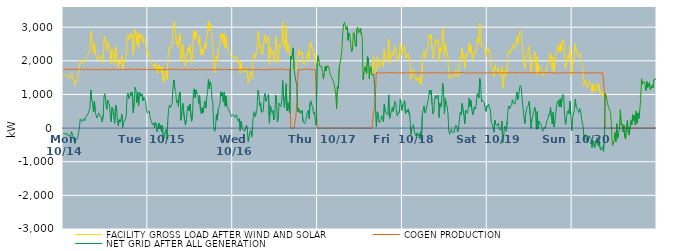
| Category | FACILITY GROSS LOAD AFTER WIND AND SOLAR | COGEN PRODUCTION | NET GRID AFTER ALL GENERATION |
|---|---|---|---|
|  Mon  10/14 | 1557 | 1737 | -180 |
|  Mon  10/14 | 1597 | 1738 | -141 |
|  Mon  10/14 | 1559 | 1751 | -192 |
|  Mon  10/14 | 1537 | 1734 | -197 |
|  Mon  10/14 | 1590 | 1742 | -152 |
|  Mon  10/14 | 1512 | 1739 | -227 |
|  Mon  10/14 | 1540 | 1753 | -213 |
|  Mon  10/14 | 1516 | 1740 | -224 |
|  Mon  10/14 | 1468 | 1740 | -272 |
|  Mon  10/14 | 1638 | 1750 | -112 |
|  Mon  10/14 | 1569 | 1753 | -184 |
|  Mon  10/14 | 1485 | 1739 | -254 |
|  Mon  10/14 | 1386 | 1749 | -363 |
|  Mon  10/14 | 1278 | 1735 | -457 |
|  Mon  10/14 | 1396 | 1739 | -343 |
|  Mon  10/14 | 1387 | 1740 | -353 |
|  Mon  10/14 | 1442 | 1753 | -311 |
|  Mon  10/14 | 1597 | 1740 | -143 |
|  Mon  10/14 | 1740 | 1747 | -7 |
|  Mon  10/14 | 2019 | 1745 | 274 |
|  Mon  10/14 | 2009 | 1754 | 255 |
|  Mon  10/14 | 1947 | 1752 | 195 |
|  Mon  10/14 | 1986 | 1748 | 238 |
|  Mon  10/14 | 2015 | 1734 | 281 |
|  Mon  10/14 | 1938 | 1726 | 212 |
|  Mon  10/14 | 2038 | 1733 | 305 |
|  Mon  10/14 | 2104 | 1753 | 351 |
|  Mon  10/14 | 2098 | 1733 | 365 |
|  Mon  10/14 | 2178 | 1740 | 438 |
|  Mon  10/14 | 2197 | 1730 | 467 |
|  Mon  10/14 | 2330 | 1736 | 594 |
|  Mon  10/14 | 2872 | 1736 | 1136 |
|  Mon  10/14 | 2583 | 1749 | 834 |
|  Mon  10/14 | 2475 | 1737 | 738 |
|  Mon  10/14 | 2219 | 1736 | 483 |
|  Mon  10/14 | 2541 | 1736 | 805 |
|  Mon  10/14 | 2224 | 1738 | 486 |
|  Mon  10/14 | 2117 | 1745 | 372 |
|  Mon  10/14 | 2027 | 1731 | 296 |
|  Mon  10/14 | 2060 | 1746 | 314 |
|  Mon  10/14 | 2196 | 1744 | 452 |
|  Mon  10/14 | 2138 | 1734 | 404 |
|  Mon  10/14 | 2156 | 1737 | 419 |
|  Mon  10/14 | 2019 | 1746 | 273 |
|  Mon  10/14 | 1931 | 1749 | 182 |
|  Mon  10/14 | 2136 | 1732 | 404 |
|  Mon  10/14 | 2708 | 1741 | 967 |
|  Mon  10/14 | 2744 | 1721 | 1023 |
|  Mon  10/14 | 2759 | 1751 | 1008 |
|  Mon  10/14 | 2302 | 1742 | 560 |
|  Mon  10/14 | 2566 | 1741 | 825 |
|  Mon  10/14 | 2498 | 1740 | 758 |
|  Mon  10/14 | 2456 | 1737 | 719 |
|  Mon  10/14 | 2161 | 1759 | 402 |
|  Mon  10/14 | 1920 | 1731 | 189 |
|  Mon  10/14 | 2348 | 1734 | 614 |
|  Mon  10/14 | 2303 | 1743 | 560 |
|  Mon  10/14 | 2276 | 1744 | 532 |
|  Mon  10/14 | 1890 | 1751 | 139 |
|  Mon  10/14 | 2427 | 1741 | 686 |
|  Mon  10/14 | 2377 | 1741 | 636 |
|  Mon  10/14 | 1966 | 1733 | 233 |
|  Mon  10/14 | 1806 | 1737 | 69 |
|  Mon  10/14 | 1993 | 1742 | 251 |
|  Mon  10/14 | 1920 | 1739 | 181 |
|  Mon  10/14 | 1980 | 1741 | 239 |
|  Mon  10/14 | 2172 | 1752 | 420 |
|  Mon  10/14 | 1762 | 1739 | 23 |
|  Mon  10/14 | 1894 | 1737 | 157 |
|  Mon  10/14 | 1911 | 1741 | 170 |
|  Mon  10/14 | 2014 | 1747 | 267 |
|  Mon  10/14 | 2098 | 1733 | 365 |
|  Mon  10/14 | 2696 | 1737 | 959 |
|  Mon  10/14 | 2774 | 1741 | 1033 |
|  Mon  10/14 | 2630 | 1751 | 879 |
|  Mon  10/14 | 2670 | 1744 | 926 |
|  Mon  10/14 | 2810 | 1744 | 1066 |
|  Mon  10/14 | 2681 | 1727 | 954 |
|  Mon  10/14 | 2818 | 1747 | 1071 |
|  Mon  10/14 | 2192 | 1732 | 460 |
|  Mon  10/14 | 2474 | 1735 | 739 |
|  Mon  10/14 | 2946 | 1736 | 1210 |
|  Mon  10/14 | 2874 | 1752 | 1122 |
|  Mon  10/14 | 2503 | 1745 | 758 |
|  Mon  10/14 | 2814 | 1751 | 1063 |
|  Mon  10/14 | 2398 | 1734 | 664 |
|  Mon  10/14 | 2811 | 1743 | 1068 |
|  Mon  10/14 | 2832 | 1746 | 1086 |
|  Mon  10/14 | 2689 | 1742 | 947 |
|  Mon  10/14 | 2757 | 1740 | 1017 |
|  Mon  10/14 | 2555 | 1739 | 816 |
|  Mon  10/14 | 2664 | 1752 | 912 |
|  Mon  10/14 | 2667 | 1747 | 920 |
|  Mon  10/14 | 2534 | 1741 | 793 |
|  Mon  10/14 | 2280 | 1745 | 535 |
|  Mon  10/14 | 2188 | 1743 | 445 |
|  Tue  10/15 | 2181 | 1737 | 444 |
|  Tue  10/15 | 2256 | 1749 | 507 |
|  Tue  10/15 | 2078 | 1742 | 336 |
|  Tue  10/15 | 1961 | 1734 | 227 |
|  Tue  10/15 | 1934 | 1732 | 202 |
|  Tue  10/15 | 1851 | 1750 | 101 |
|  Tue  10/15 | 1900 | 1749 | 151 |
|  Tue  10/15 | 1756 | 1749 | 7 |
|  Tue  10/15 | 1922 | 1743 | 179 |
|  Tue  10/15 | 1841 | 1746 | 95 |
|  Tue  10/15 | 1628 | 1737 | -109 |
|  Tue  10/15 | 1639 | 1743 | -104 |
|  Tue  10/15 | 1879 | 1730 | 149 |
|  Tue  10/15 | 1718 | 1744 | -26 |
|  Tue  10/15 | 1823 | 1735 | 88 |
|  Tue  10/15 | 1634 | 1735 | -101 |
|  Tue  10/15 | 1818 | 1745 | 73 |
|  Tue  10/15 | 1351 | 1754 | -403 |
|  Tue  10/15 | 1507 | 1732 | -225 |
|  Tue  10/15 | 1522 | 1740 | -218 |
|  Tue  10/15 | 1686 | 1735 | -49 |
|  Tue  10/15 | 1428 | 1750 | -322 |
|  Tue  10/15 | 1945 | 1748 | 197 |
|  Tue  10/15 | 2331 | 1748 | 583 |
|  Tue  10/15 | 2430 | 1741 | 689 |
|  Tue  10/15 | 2339 | 1731 | 608 |
|  Tue  10/15 | 2426 | 1761 | 665 |
|  Tue  10/15 | 2480 | 1750 | 730 |
|  Tue  10/15 | 2972 | 1742 | 1230 |
|  Tue  10/15 | 3164 | 1734 | 1430 |
|  Tue  10/15 | 2899 | 1740 | 1159 |
|  Tue  10/15 | 2823 | 1734 | 1089 |
|  Tue  10/15 | 2508 | 1745 | 763 |
|  Tue  10/15 | 2580 | 1763 | 817 |
|  Tue  10/15 | 2381 | 1738 | 643 |
|  Tue  10/15 | 2758 | 1746 | 1012 |
|  Tue  10/15 | 2813 | 1739 | 1074 |
|  Tue  10/15 | 1974 | 1741 | 233 |
|  Tue  10/15 | 2210 | 1733 | 477 |
|  Tue  10/15 | 2478 | 1745 | 733 |
|  Tue  10/15 | 2484 | 1742 | 742 |
|  Tue  10/15 | 2005 | 1753 | 252 |
|  Tue  10/15 | 1838 | 1752 | 86 |
|  Tue  10/15 | 1979 | 1736 | 243 |
|  Tue  10/15 | 2238 | 1743 | 495 |
|  Tue  10/15 | 2380 | 1725 | 655 |
|  Tue  10/15 | 2247 | 1735 | 512 |
|  Tue  10/15 | 2466 | 1747 | 719 |
|  Tue  10/15 | 2464 | 1744 | 720 |
|  Tue  10/15 | 1934 | 1731 | 203 |
|  Tue  10/15 | 2134 | 1749 | 385 |
|  Tue  10/15 | 2801 | 1739 | 1062 |
|  Tue  10/15 | 2907 | 1739 | 1168 |
|  Tue  10/15 | 2636 | 1742 | 894 |
|  Tue  10/15 | 2876 | 1740 | 1136 |
|  Tue  10/15 | 2763 | 1742 | 1021 |
|  Tue  10/15 | 2719 | 1730 | 989 |
|  Tue  10/15 | 2485 | 1753 | 732 |
|  Tue  10/15 | 2727 | 1751 | 976 |
|  Tue  10/15 | 2277 | 1744 | 533 |
|  Tue  10/15 | 2165 | 1742 | 423 |
|  Tue  10/15 | 2349 | 1743 | 606 |
|  Tue  10/15 | 2186 | 1734 | 452 |
|  Tue  10/15 | 2391 | 1749 | 642 |
|  Tue  10/15 | 2523 | 1729 | 794 |
|  Tue  10/15 | 2357 | 1757 | 600 |
|  Tue  10/15 | 2651 | 1746 | 905 |
|  Tue  10/15 | 2808 | 1744 | 1064 |
|  Tue  10/15 | 3188 | 1737 | 1451 |
|  Tue  10/15 | 2895 | 1730 | 1165 |
|  Tue  10/15 | 3116 | 1735 | 1381 |
|  Tue  10/15 | 3062 | 1741 | 1321 |
|  Tue  10/15 | 2640 | 1743 | 897 |
|  Tue  10/15 | 2497 | 1753 | 744 |
|  Tue  10/15 | 1772 | 1735 | 37 |
|  Tue  10/15 | 1643 | 1736 | -93 |
|  Tue  10/15 | 1749 | 1732 | 17 |
|  Tue  10/15 | 2144 | 1732 | 412 |
|  Tue  10/15 | 1978 | 1743 | 235 |
|  Tue  10/15 | 2267 | 1743 | 524 |
|  Tue  10/15 | 2387 | 1751 | 636 |
|  Tue  10/15 | 2466 | 1748 | 718 |
|  Tue  10/15 | 2826 | 1744 | 1082 |
|  Tue  10/15 | 2699 | 1744 | 955 |
|  Tue  10/15 | 2787 | 1733 | 1054 |
|  Tue  10/15 | 2527 | 1754 | 773 |
|  Tue  10/15 | 2806 | 1743 | 1063 |
|  Tue  10/15 | 2388 | 1735 | 653 |
|  Tue  10/15 | 2701 | 1742 | 959 |
|  Tue  10/15 | 2372 | 1729 | 643 |
|  Tue  10/15 | 2339 | 1744 | 595 |
|  Tue  10/15 | 2274 | 1731 | 543 |
|  Tue  10/15 | 2206 | 1737 | 469 |
|  Tue  10/15 | 2171 | 1740 | 431 |
|  Tue  10/15 | 2085 | 1739 | 346 |
|  Tue  10/15 | 2104 | 1747 | 357 |
|  Wed  10/16 | 2139 | 1732 | 407 |
|  Wed  10/16 | 2126 | 1745 | 381 |
|  Wed  10/16 | 2059 | 1740 | 319 |
|  Wed  10/16 | 2055 | 1751 | 304 |
|  Wed  10/16 | 2135 | 1736 | 399 |
|  Wed  10/16 | 1983 | 1748 | 235 |
|  Wed  10/16 | 1936 | 1745 | 191 |
|  Wed  10/16 | 2026 | 1738 | 288 |
|  Wed  10/16 | 1647 | 1731 | -84 |
|  Wed  10/16 | 1947 | 1745 | 202 |
|  Wed  10/16 | 1768 | 1741 | 27 |
|  Wed  10/16 | 1709 | 1741 | -32 |
|  Wed  10/16 | 1734 | 1758 | -24 |
|  Wed  10/16 | 1656 | 1755 | -99 |
|  Wed  10/16 | 1652 | 1752 | -100 |
|  Wed  10/16 | 1818 | 1736 | 82 |
|  Wed  10/16 | 1714 | 1740 | -26 |
|  Wed  10/16 | 1334 | 1741 | -407 |
|  Wed  10/16 | 1495 | 1748 | -253 |
|  Wed  10/16 | 1632 | 1744 | -112 |
|  Wed  10/16 | 1669 | 1740 | -71 |
|  Wed  10/16 | 1471 | 1732 | -261 |
|  Wed  10/16 | 1800 | 1736 | 64 |
|  Wed  10/16 | 2164 | 1735 | 429 |
|  Wed  10/16 | 2232 | 1740 | 492 |
|  Wed  10/16 | 2078 | 1742 | 336 |
|  Wed  10/16 | 2191 | 1738 | 453 |
|  Wed  10/16 | 2320 | 1736 | 584 |
|  Wed  10/16 | 2869 | 1745 | 1124 |
|  Wed  10/16 | 2807 | 1750 | 1057 |
|  Wed  10/16 | 2401 | 1739 | 662 |
|  Wed  10/16 | 2496 | 1745 | 751 |
|  Wed  10/16 | 2213 | 1740 | 473 |
|  Wed  10/16 | 2176 | 1732 | 444 |
|  Wed  10/16 | 2231 | 1737 | 494 |
|  Wed  10/16 | 2653 | 1739 | 914 |
|  Wed  10/16 | 2761 | 1733 | 1028 |
|  Wed  10/16 | 2531 | 1731 | 800 |
|  Wed  10/16 | 2616 | 1744 | 872 |
|  Wed  10/16 | 2596 | 1740 | 856 |
|  Wed  10/16 | 2731 | 1729 | 1002 |
|  Wed  10/16 | 1883 | 1738 | 145 |
|  Wed  10/16 | 2412 | 1746 | 666 |
|  Wed  10/16 | 2317 | 1752 | 565 |
|  Wed  10/16 | 2211 | 1750 | 461 |
|  Wed  10/16 | 2268 | 1747 | 521 |
|  Wed  10/16 | 1987 | 1745 | 242 |
|  Wed  10/16 | 2026 | 1742 | 284 |
|  Wed  10/16 | 2736 | 1750 | 986 |
|  Wed  10/16 | 2637 | 1747 | 890 |
|  Wed  10/16 | 1919 | 1739 | 180 |
|  Wed  10/16 | 2053 | 1739 | 314 |
|  Wed  10/16 | 2489 | 1755 | 734 |
|  Wed  10/16 | 2416 | 1745 | 671 |
|  Wed  10/16 | 2396 | 1759 | 637 |
|  Wed  10/16 | 2569 | 1741 | 828 |
|  Wed  10/16 | 3161 | 1747 | 1414 |
|  Wed  10/16 | 2585 | 1738 | 847 |
|  Wed  10/16 | 2352 | 1741 | 611 |
|  Wed  10/16 | 2694 | 1743 | 951 |
|  Wed  10/16 | 3051 | 1731 | 1320 |
|  Wed  10/16 | 2267 | 1758 | 509 |
|  Wed  10/16 | 2490 | 1738 | 752 |
|  Wed  10/16 | 2510 | 1732 | 778 |
|  Wed  10/16 | 2192 | 1743 | 449 |
|  Wed  10/16 | 2133 | 0 | 2133 |
|  Wed  10/16 | 2024 | 0 | 2024 |
|  Wed  10/16 | 2025 | 0 | 2025 |
|  Wed  10/16 | 2384 | 0 | 2384 |
|  Wed  10/16 | 1730 | 0 | 1730 |
|  Wed  10/16 | 1739 | 0 | 1739 |
|  Wed  10/16 | 1740 | 350 | 1390 |
|  Wed  10/16 | 2024 | 740 | 1284 |
|  Wed  10/16 | 1983 | 1493 | 490 |
|  Wed  10/16 | 2355 | 1758 | 597 |
|  Wed  10/16 | 2179 | 1722 | 457 |
|  Wed  10/16 | 2239 | 1729 | 510 |
|  Wed  10/16 | 2184 | 1743 | 441 |
|  Wed  10/16 | 2259 | 1733 | 526 |
|  Wed  10/16 | 1932 | 1738 | 194 |
|  Wed  10/16 | 1924 | 1742 | 182 |
|  Wed  10/16 | 1886 | 1755 | 131 |
|  Wed  10/16 | 1958 | 1743 | 215 |
|  Wed  10/16 | 1948 | 1750 | 198 |
|  Wed  10/16 | 2232 | 1752 | 480 |
|  Wed  10/16 | 2276 | 1749 | 527 |
|  Wed  10/16 | 2007 | 1734 | 273 |
|  Wed  10/16 | 2503 | 1746 | 757 |
|  Wed  10/16 | 2551 | 1738 | 813 |
|  Wed  10/16 | 2422 | 1742 | 680 |
|  Wed  10/16 | 2360 | 1737 | 623 |
|  Wed  10/16 | 2160 | 1738 | 422 |
|  Wed  10/16 | 2229 | 1757 | 472 |
|  Wed  10/16 | 1967 | 1745 | 222 |
|  Wed  10/16 | 1808 | 1730 | 78 |
|  Wed  10/16 | 1935 | 0 | 1935 |
|  Thu  10/17 | 2157 | 0 | 2157 |
|  Thu  10/17 | 1994 | 0 | 1994 |
|  Thu  10/17 | 1842 | 0 | 1842 |
|  Thu  10/17 | 1865 | 0 | 1865 |
|  Thu  10/17 | 1836 | 0 | 1836 |
|  Thu  10/17 | 1656 | 0 | 1656 |
|  Thu  10/17 | 1463 | 0 | 1463 |
|  Thu  10/17 | 1619 | 0 | 1619 |
|  Thu  10/17 | 1829 | 0 | 1829 |
|  Thu  10/17 | 1696 | 0 | 1696 |
|  Thu  10/17 | 1854 | 0 | 1854 |
|  Thu  10/17 | 1803 | 0 | 1803 |
|  Thu  10/17 | 1837 | 0 | 1837 |
|  Thu  10/17 | 1694 | 0 | 1694 |
|  Thu  10/17 | 1579 | 0 | 1579 |
|  Thu  10/17 | 1523 | 0 | 1523 |
|  Thu  10/17 | 1472 | 0 | 1472 |
|  Thu  10/17 | 1493 | 0 | 1493 |
|  Thu  10/17 | 1354 | 0 | 1354 |
|  Thu  10/17 | 1325 | 0 | 1325 |
|  Thu  10/17 | 1025 | 0 | 1025 |
|  Thu  10/17 | 575 | 0 | 575 |
|  Thu  10/17 | 1244 | 0 | 1244 |
|  Thu  10/17 | 1177 | 0 | 1177 |
|  Thu  10/17 | 1797 | 0 | 1797 |
|  Thu  10/17 | 1817 | 0 | 1817 |
|  Thu  10/17 | 2083 | 0 | 2083 |
|  Thu  10/17 | 2340 | 0 | 2340 |
|  Thu  10/17 | 2821 | 0 | 2821 |
|  Thu  10/17 | 3094 | 0 | 3094 |
|  Thu  10/17 | 3138 | 0 | 3138 |
|  Thu  10/17 | 3014 | 0 | 3014 |
|  Thu  10/17 | 2925 | 0 | 2925 |
|  Thu  10/17 | 3019 | 0 | 3019 |
|  Thu  10/17 | 2608 | 0 | 2608 |
|  Thu  10/17 | 2828 | 0 | 2828 |
|  Thu  10/17 | 2751 | 0 | 2751 |
|  Thu  10/17 | 2488 | 0 | 2488 |
|  Thu  10/17 | 2267 | 0 | 2267 |
|  Thu  10/17 | 2349 | 0 | 2349 |
|  Thu  10/17 | 2843 | 0 | 2843 |
|  Thu  10/17 | 2803 | 0 | 2803 |
|  Thu  10/17 | 2482 | 0 | 2482 |
|  Thu  10/17 | 2416 | 0 | 2416 |
|  Thu  10/17 | 2942 | 0 | 2942 |
|  Thu  10/17 | 2997 | 0 | 2997 |
|  Thu  10/17 | 2833 | 0 | 2833 |
|  Thu  10/17 | 2896 | 0 | 2896 |
|  Thu  10/17 | 2970 | 0 | 2970 |
|  Thu  10/17 | 2784 | 0 | 2784 |
|  Thu  10/17 | 2702 | 0 | 2702 |
|  Thu  10/17 | 1445 | 0 | 1445 |
|  Thu  10/17 | 1668 | 0 | 1668 |
|  Thu  10/17 | 1821 | 0 | 1821 |
|  Thu  10/17 | 1846 | 0 | 1846 |
|  Thu  10/17 | 1627 | 0 | 1627 |
|  Thu  10/17 | 2126 | 0 | 2126 |
|  Thu  10/17 | 2073 | 0 | 2073 |
|  Thu  10/17 | 1471 | 0 | 1471 |
|  Thu  10/17 | 1791 | 0 | 1791 |
|  Thu  10/17 | 1830 | 0 | 1830 |
|  Thu  10/17 | 1571 | 0 | 1571 |
|  Thu  10/17 | 1587 | 0 | 1587 |
|  Thu  10/17 | 2109 | 509 | 1600 |
|  Thu  10/17 | 1902 | 637 | 1265 |
|  Thu  10/17 | 1632 | 1081 | 551 |
|  Thu  10/17 | 1689 | 1656 | 33 |
|  Thu  10/17 | 2126 | 1641 | 485 |
|  Thu  10/17 | 2088 | 1645 | 443 |
|  Thu  10/17 | 1810 | 1643 | 167 |
|  Thu  10/17 | 1805 | 1644 | 161 |
|  Thu  10/17 | 1862 | 1647 | 215 |
|  Thu  10/17 | 1997 | 1629 | 368 |
|  Thu  10/17 | 1963 | 1643 | 320 |
|  Thu  10/17 | 1827 | 1646 | 181 |
|  Thu  10/17 | 2346 | 1639 | 707 |
|  Thu  10/17 | 2146 | 1635 | 511 |
|  Thu  10/17 | 2098 | 1632 | 466 |
|  Thu  10/17 | 2076 | 1648 | 428 |
|  Thu  10/17 | 2014 | 1635 | 379 |
|  Thu  10/17 | 2637 | 1648 | 989 |
|  Thu  10/17 | 1926 | 1635 | 291 |
|  Thu  10/17 | 2060 | 1656 | 404 |
|  Thu  10/17 | 2166 | 1647 | 519 |
|  Thu  10/17 | 2250 | 1643 | 607 |
|  Thu  10/17 | 2140 | 1645 | 495 |
|  Thu  10/17 | 2297 | 1644 | 653 |
|  Thu  10/17 | 2432 | 1633 | 799 |
|  Thu  10/17 | 2383 | 1651 | 732 |
|  Thu  10/17 | 2064 | 1645 | 419 |
|  Thu  10/17 | 1992 | 1635 | 357 |
|  Thu  10/17 | 2130 | 1643 | 487 |
|  Thu  10/17 | 2094 | 1640 | 454 |
|  Thu  10/17 | 2517 | 1650 | 867 |
|  Thu  10/17 | 2386 | 1640 | 746 |
|  Thu  10/17 | 2170 | 1643 | 527 |
|  Fri  10/18 | 2346 | 1649 | 697 |
|  Fri  10/18 | 2374 | 1639 | 735 |
|  Fri  10/18 | 2449 | 1636 | 813 |
|  Fri  10/18 | 2064 | 1639 | 425 |
|  Fri  10/18 | 2162 | 1643 | 519 |
|  Fri  10/18 | 2122 | 1640 | 482 |
|  Fri  10/18 | 2214 | 1643 | 571 |
|  Fri  10/18 | 2198 | 1646 | 552 |
|  Fri  10/18 | 1980 | 1643 | 337 |
|  Fri  10/18 | 1462 | 1649 | -187 |
|  Fri  10/18 | 1623 | 1649 | -26 |
|  Fri  10/18 | 1694 | 1645 | 49 |
|  Fri  10/18 | 1744 | 1636 | 108 |
|  Fri  10/18 | 1535 | 1641 | -106 |
|  Fri  10/18 | 1555 | 1646 | -91 |
|  Fri  10/18 | 1400 | 1637 | -237 |
|  Fri  10/18 | 1503 | 1641 | -138 |
|  Fri  10/18 | 1425 | 1636 | -211 |
|  Fri  10/18 | 1473 | 1642 | -169 |
|  Fri  10/18 | 1326 | 1654 | -328 |
|  Fri  10/18 | 1545 | 1646 | -101 |
|  Fri  10/18 | 1308 | 1649 | -341 |
|  Fri  10/18 | 2042 | 1640 | 402 |
|  Fri  10/18 | 2175 | 1642 | 533 |
|  Fri  10/18 | 2303 | 1645 | 658 |
|  Fri  10/18 | 2084 | 1632 | 452 |
|  Fri  10/18 | 2141 | 1637 | 504 |
|  Fri  10/18 | 2265 | 1640 | 625 |
|  Fri  10/18 | 2425 | 1640 | 785 |
|  Fri  10/18 | 2505 | 1642 | 863 |
|  Fri  10/18 | 2780 | 1649 | 1131 |
|  Fri  10/18 | 2654 | 1646 | 1008 |
|  Fri  10/18 | 2773 | 1647 | 1126 |
|  Fri  10/18 | 2363 | 1645 | 718 |
|  Fri  10/18 | 2061 | 1633 | 428 |
|  Fri  10/18 | 2144 | 1641 | 503 |
|  Fri  10/18 | 2511 | 1650 | 861 |
|  Fri  10/18 | 2628 | 1657 | 971 |
|  Fri  10/18 | 2512 | 1648 | 864 |
|  Fri  10/18 | 2585 | 1640 | 945 |
|  Fri  10/18 | 2632 | 1643 | 989 |
|  Fri  10/18 | 1967 | 1651 | 316 |
|  Fri  10/18 | 2384 | 1646 | 738 |
|  Fri  10/18 | 2275 | 1640 | 635 |
|  Fri  10/18 | 2438 | 1630 | 808 |
|  Fri  10/18 | 2981 | 1640 | 1341 |
|  Fri  10/18 | 2712 | 1644 | 1068 |
|  Fri  10/18 | 2081 | 1652 | 429 |
|  Fri  10/18 | 2523 | 1640 | 883 |
|  Fri  10/18 | 2356 | 1640 | 716 |
|  Fri  10/18 | 2286 | 1638 | 648 |
|  Fri  10/18 | 2088 | 1637 | 451 |
|  Fri  10/18 | 1535 | 1641 | -106 |
|  Fri  10/18 | 1465 | 1650 | -185 |
|  Fri  10/18 | 1569 | 1640 | -71 |
|  Fri  10/18 | 1588 | 1627 | -39 |
|  Fri  10/18 | 1519 | 1644 | -125 |
|  Fri  10/18 | 1501 | 1648 | -147 |
|  Fri  10/18 | 1515 | 1644 | -129 |
|  Fri  10/18 | 1673 | 1652 | 21 |
|  Fri  10/18 | 1734 | 1645 | 89 |
|  Fri  10/18 | 1688 | 1634 | 54 |
|  Fri  10/18 | 1529 | 1639 | -110 |
|  Fri  10/18 | 1620 | 1632 | -12 |
|  Fri  10/18 | 1918 | 1654 | 264 |
|  Fri  10/18 | 2119 | 1645 | 474 |
|  Fri  10/18 | 2055 | 1644 | 411 |
|  Fri  10/18 | 2379 | 1645 | 734 |
|  Fri  10/18 | 2373 | 1656 | 717 |
|  Fri  10/18 | 2048 | 1657 | 391 |
|  Fri  10/18 | 1778 | 1652 | 126 |
|  Fri  10/18 | 2190 | 1656 | 534 |
|  Fri  10/18 | 2110 | 1627 | 483 |
|  Fri  10/18 | 2087 | 1644 | 443 |
|  Fri  10/18 | 2230 | 1639 | 591 |
|  Fri  10/18 | 2531 | 1639 | 892 |
|  Fri  10/18 | 2272 | 1628 | 644 |
|  Fri  10/18 | 2455 | 1628 | 827 |
|  Fri  10/18 | 2192 | 1648 | 544 |
|  Fri  10/18 | 2031 | 1640 | 391 |
|  Fri  10/18 | 2020 | 1640 | 380 |
|  Fri  10/18 | 2276 | 1644 | 632 |
|  Fri  10/18 | 2215 | 1642 | 573 |
|  Fri  10/18 | 2319 | 1638 | 681 |
|  Fri  10/18 | 2668 | 1646 | 1022 |
|  Fri  10/18 | 2654 | 1644 | 1010 |
|  Fri  10/18 | 2530 | 1636 | 894 |
|  Fri  10/18 | 3109 | 1641 | 1468 |
|  Fri  10/18 | 2937 | 1643 | 1294 |
|  Fri  10/18 | 2417 | 1634 | 783 |
|  Fri  10/18 | 2465 | 1636 | 829 |
|  Fri  10/18 | 2453 | 1640 | 813 |
|  Fri  10/18 | 2398 | 1643 | 755 |
|  Fri  10/18 | 2238 | 1645 | 593 |
|  Fri  10/18 | 2136 | 1642 | 494 |
|  Fri  10/18 | 2305 | 1641 | 664 |
|  Sat  10/19 | 2266 | 1637 | 629 |
|  Sat  10/19 | 2362 | 1651 | 711 |
|  Sat  10/19 | 2248 | 1654 | 594 |
|  Sat  10/19 | 2194 | 1645 | 549 |
|  Sat  10/19 | 1827 | 1644 | 183 |
|  Sat  10/19 | 1766 | 1636 | 130 |
|  Sat  10/19 | 1769 | 1633 | 136 |
|  Sat  10/19 | 1520 | 1641 | -121 |
|  Sat  10/19 | 1877 | 1642 | 235 |
|  Sat  10/19 | 1740 | 1635 | 105 |
|  Sat  10/19 | 1718 | 1650 | 68 |
|  Sat  10/19 | 1709 | 1635 | 74 |
|  Sat  10/19 | 1785 | 1640 | 145 |
|  Sat  10/19 | 1602 | 1640 | -38 |
|  Sat  10/19 | 1620 | 1634 | -14 |
|  Sat  10/19 | 1594 | 1648 | -54 |
|  Sat  10/19 | 1837 | 1632 | 205 |
|  Sat  10/19 | 1203 | 1638 | -435 |
|  Sat  10/19 | 1386 | 1653 | -267 |
|  Sat  10/19 | 1706 | 1646 | 60 |
|  Sat  10/19 | 1667 | 1639 | 28 |
|  Sat  10/19 | 1550 | 1643 | -93 |
|  Sat  10/19 | 1857 | 1644 | 213 |
|  Sat  10/19 | 2198 | 1650 | 548 |
|  Sat  10/19 | 2307 | 1647 | 660 |
|  Sat  10/19 | 2222 | 1641 | 581 |
|  Sat  10/19 | 2288 | 1638 | 650 |
|  Sat  10/19 | 2324 | 1642 | 682 |
|  Sat  10/19 | 2484 | 1645 | 839 |
|  Sat  10/19 | 2376 | 1627 | 749 |
|  Sat  10/19 | 2385 | 1649 | 736 |
|  Sat  10/19 | 2367 | 1656 | 711 |
|  Sat  10/19 | 2372 | 1644 | 728 |
|  Sat  10/19 | 2721 | 1650 | 1071 |
|  Sat  10/19 | 2500 | 1647 | 853 |
|  Sat  10/19 | 2578 | 1639 | 939 |
|  Sat  10/19 | 2847 | 1645 | 1202 |
|  Sat  10/19 | 2908 | 1637 | 1271 |
|  Sat  10/19 | 2852 | 1644 | 1208 |
|  Sat  10/19 | 2479 | 1642 | 837 |
|  Sat  10/19 | 2210 | 1636 | 574 |
|  Sat  10/19 | 1951 | 1644 | 307 |
|  Sat  10/19 | 1781 | 1643 | 138 |
|  Sat  10/19 | 2075 | 1645 | 430 |
|  Sat  10/19 | 2225 | 1651 | 574 |
|  Sat  10/19 | 2217 | 1644 | 573 |
|  Sat  10/19 | 2337 | 1656 | 681 |
|  Sat  10/19 | 2430 | 1635 | 795 |
|  Sat  10/19 | 2030 | 1642 | 388 |
|  Sat  10/19 | 1634 | 1642 | -8 |
|  Sat  10/19 | 1929 | 1646 | 283 |
|  Sat  10/19 | 1901 | 1642 | 259 |
|  Sat  10/19 | 2119 | 1647 | 472 |
|  Sat  10/19 | 2263 | 1637 | 626 |
|  Sat  10/19 | 2181 | 1639 | 542 |
|  Sat  10/19 | 1600 | 1647 | -47 |
|  Sat  10/19 | 2125 | 1635 | 490 |
|  Sat  10/19 | 1614 | 1639 | -25 |
|  Sat  10/19 | 1862 | 1654 | 208 |
|  Sat  10/19 | 1865 | 1644 | 221 |
|  Sat  10/19 | 1770 | 1646 | 124 |
|  Sat  10/19 | 1686 | 1644 | 42 |
|  Sat  10/19 | 1544 | 1641 | -97 |
|  Sat  10/19 | 1594 | 1638 | -44 |
|  Sat  10/19 | 1678 | 1653 | 25 |
|  Sat  10/19 | 1616 | 1638 | -22 |
|  Sat  10/19 | 1646 | 1645 | 1 |
|  Sat  10/19 | 1862 | 1637 | 225 |
|  Sat  10/19 | 1918 | 1646 | 272 |
|  Sat  10/19 | 2056 | 1639 | 417 |
|  Sat  10/19 | 2032 | 1646 | 386 |
|  Sat  10/19 | 2256 | 1639 | 617 |
|  Sat  10/19 | 1984 | 1649 | 335 |
|  Sat  10/19 | 1760 | 1640 | 120 |
|  Sat  10/19 | 2108 | 1644 | 464 |
|  Sat  10/19 | 1675 | 1640 | 35 |
|  Sat  10/19 | 1829 | 1636 | 193 |
|  Sat  10/19 | 2109 | 1651 | 458 |
|  Sat  10/19 | 2309 | 1634 | 675 |
|  Sat  10/19 | 2437 | 1651 | 786 |
|  Sat  10/19 | 2451 | 1632 | 819 |
|  Sat  10/19 | 2271 | 1644 | 627 |
|  Sat  10/19 | 2514 | 1644 | 870 |
|  Sat  10/19 | 2272 | 1648 | 624 |
|  Sat  10/19 | 2536 | 1643 | 893 |
|  Sat  10/19 | 2636 | 1632 | 1004 |
|  Sat  10/19 | 2553 | 1636 | 917 |
|  Sat  10/19 | 2002 | 1647 | 355 |
|  Sat  10/19 | 1752 | 1646 | 106 |
|  Sat  10/19 | 1951 | 1644 | 307 |
|  Sat  10/19 | 2096 | 1641 | 455 |
|  Sat  10/19 | 2169 | 1643 | 526 |
|  Sat  10/19 | 2068 | 1642 | 426 |
|  Sat  10/19 | 2424 | 1630 | 794 |
|  Sat  10/19 | 2036 | 1644 | 392 |
|  Sat  10/19 | 1552 | 1634 | -82 |
|  Sun  10/20 | 1972 | 1644 | 328 |
|  Sun  10/20 | 1934 | 1631 | 303 |
|  Sun  10/20 | 2165 | 1644 | 521 |
|  Sun  10/20 | 2505 | 1645 | 860 |
|  Sun  10/20 | 2292 | 1652 | 640 |
|  Sun  10/20 | 2202 | 1625 | 577 |
|  Sun  10/20 | 2173 | 1637 | 536 |
|  Sun  10/20 | 2116 | 1653 | 463 |
|  Sun  10/20 | 2219 | 1639 | 580 |
|  Sun  10/20 | 2154 | 1637 | 517 |
|  Sun  10/20 | 1979 | 1653 | 326 |
|  Sun  10/20 | 1789 | 1641 | 148 |
|  Sun  10/20 | 1689 | 1642 | 47 |
|  Sun  10/20 | 1270 | 1650 | -380 |
|  Sun  10/20 | 1440 | 1635 | -195 |
|  Sun  10/20 | 1395 | 1655 | -260 |
|  Sun  10/20 | 1261 | 1645 | -384 |
|  Sun  10/20 | 1201 | 1635 | -434 |
|  Sun  10/20 | 1322 | 1640 | -318 |
|  Sun  10/20 | 1406 | 1635 | -229 |
|  Sun  10/20 | 1340 | 1646 | -306 |
|  Sun  10/20 | 1313 | 1660 | -347 |
|  Sun  10/20 | 1057 | 1639 | -582 |
|  Sun  10/20 | 1293 | 1651 | -358 |
|  Sun  10/20 | 1305 | 1644 | -339 |
|  Sun  10/20 | 1069 | 1652 | -583 |
|  Sun  10/20 | 1243 | 1651 | -408 |
|  Sun  10/20 | 1217 | 1645 | -428 |
|  Sun  10/20 | 1347 | 1634 | -287 |
|  Sun  10/20 | 1118 | 1639 | -521 |
|  Sun  10/20 | 1290 | 1640 | -350 |
|  Sun  10/20 | 1048 | 1636 | -588 |
|  Sun  10/20 | 990 | 1646 | -656 |
|  Sun  10/20 | 1047 | 1643 | -596 |
|  Sun  10/20 | 1089 | 1641 | -552 |
|  Sun  10/20 | 944 | 1638 | -694 |
|  Sun  10/20 | 899 | 1093 | -194 |
|  Sun  10/20 | 1023 | 0 | 1023 |
|  Sun  10/20 | 936 | 0 | 936 |
|  Sun  10/20 | 929 | 0 | 929 |
|  Sun  10/20 | 678 | 0 | 678 |
|  Sun  10/20 | 608 | 0 | 608 |
|  Sun  10/20 | 524 | 0 | 524 |
|  Sun  10/20 | 472 | 0 | 472 |
|  Sun  10/20 | 40 | 0 | 40 |
|  Sun  10/20 | -524 | 0 | -524 |
|  Sun  10/20 | -483 | 0 | -483 |
|  Sun  10/20 | -339 | 0 | -339 |
|  Sun  10/20 | -132 | 0 | -132 |
|  Sun  10/20 | -404 | 0 | -404 |
|  Sun  10/20 | 130 | 0 | 130 |
|  Sun  10/20 | -305 | 0 | -305 |
|  Sun  10/20 | -161 | 0 | -161 |
|  Sun  10/20 | -28 | 0 | -28 |
|  Sun  10/20 | 542 | 0 | 542 |
|  Sun  10/20 | 86 | 0 | 86 |
|  Sun  10/20 | 130 | 0 | 130 |
|  Sun  10/20 | -121 | 0 | -121 |
|  Sun  10/20 | 94 | 0 | 94 |
|  Sun  10/20 | -263 | 0 | -263 |
|  Sun  10/20 | -329 | 0 | -329 |
|  Sun  10/20 | 63 | 0 | 63 |
|  Sun  10/20 | 239 | 0 | 239 |
|  Sun  10/20 | -142 | 0 | -142 |
|  Sun  10/20 | -208 | 0 | -208 |
|  Sun  10/20 | -205 | 0 | -205 |
|  Sun  10/20 | 222 | 0 | 222 |
|  Sun  10/20 | 95 | 0 | 95 |
|  Sun  10/20 | 401 | 0 | 401 |
|  Sun  10/20 | 223 | 0 | 223 |
|  Sun  10/20 | 384 | 0 | 384 |
|  Sun  10/20 | 88 | 0 | 88 |
|  Sun  10/20 | 510 | 0 | 510 |
|  Sun  10/20 | 141 | 0 | 141 |
|  Sun  10/20 | 451 | 0 | 451 |
|  Sun  10/20 | 285 | 0 | 285 |
|  Sun  10/20 | 532 | 0 | 532 |
|  Sun  10/20 | 843 | 0 | 843 |
|  Sun  10/20 | 1465 | 0 | 1465 |
|  Sun  10/20 | 1305 | 0 | 1305 |
|  Sun  10/20 | 1304 | 0 | 1304 |
|  Sun  10/20 | 1376 | 0 | 1376 |
|  Sun  10/20 | 1294 | 0 | 1294 |
|  Sun  10/20 | 1116 | 0 | 1116 |
|  Sun  10/20 | 1386 | 0 | 1386 |
|  Sun  10/20 | 1211 | 0 | 1211 |
|  Sun  10/20 | 1202 | 0 | 1202 |
|  Sun  10/20 | 1356 | 0 | 1356 |
|  Sun  10/20 | 1139 | 0 | 1139 |
|  Sun  10/20 | 1173 | 0 | 1173 |
|  Sun  10/20 | 1278 | 0 | 1278 |
|  Sun  10/20 | 1193 | 0 | 1193 |
|  Sun  10/20 | 1439 | 0 | 1439 |
|  Sun  10/20 | 1416 | 0 | 1416 |
|  Sun  10/20 | 1454 | 0 | 1454 |
|  Sun  10/20 | 1500 | 0 | 1500 |